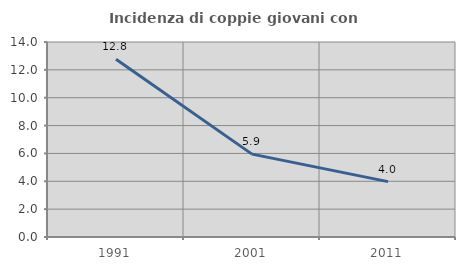
| Category | Incidenza di coppie giovani con figli |
|---|---|
| 1991.0 | 12.76 |
| 2001.0 | 5.949 |
| 2011.0 | 3.977 |